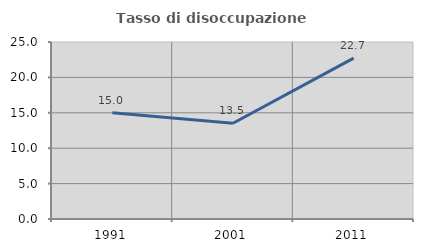
| Category | Tasso di disoccupazione giovanile  |
|---|---|
| 1991.0 | 15.016 |
| 2001.0 | 13.527 |
| 2011.0 | 22.727 |